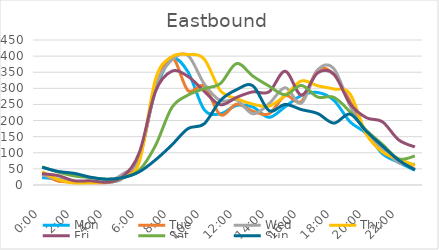
| Category | Mon | Tue | Wed | Thu | Fri | Sat | Sun |
|---|---|---|---|---|---|---|---|
| 0.0 | 23 | 35 | 32 | 41 | 35 | 56 | 55 |
| 0.041667 | 18 | 12 | 17 | 17 | 29 | 40 | 42 |
| 0.083333 | 8 | 11 | 10 | 5 | 13 | 28 | 36 |
| 0.125 | 12 | 7 | 9 | 6 | 13 | 23 | 24 |
| 0.166667 | 8 | 7 | 10 | 10 | 9 | 18 | 18 |
| 0.208333 | 22 | 23 | 35 | 25 | 27 | 23 | 23 |
| 0.25 | 92 | 83 | 84 | 72 | 101 | 46 | 41 |
| 0.291667 | 293 | 299 | 304 | 329 | 291 | 123 | 78 |
| 0.333333 | 391 | 396 | 388 | 398 | 353 | 240 | 124 |
| 0.375 | 351 | 293 | 402 | 405 | 337 | 279 | 175 |
| 0.416667 | 234 | 307 | 314 | 391 | 291 | 299 | 190 |
| 0.458333 | 221 | 218 | 262 | 293 | 249 | 315 | 262 |
| 0.5 | 247 | 251 | 264 | 268 | 272 | 377 | 296 |
| 0.541667 | 242 | 229 | 221 | 251 | 289 | 338 | 308 |
| 0.5833333333333334 | 210 | 221 | 252 | 245 | 289 | 307 | 231 |
| 0.625 | 243 | 277 | 302 | 278 | 353 | 280 | 250 |
| 0.666667 | 278 | 259 | 254 | 323 | 279 | 309 | 234 |
| 0.708333 | 287 | 357 | 357 | 308 | 348 | 273 | 222 |
| 0.75 | 263 | 343 | 361 | 298 | 344 | 272 | 192 |
| 0.791667 | 196 | 260 | 246 | 283 | 252 | 227 | 220 |
| 0.833333 | 160 | 161 | 161 | 158 | 209 | 170 | 167 |
| 0.875 | 97 | 103 | 114 | 103 | 196 | 126 | 121 |
| 0.916667 | 70 | 76 | 69 | 81 | 140 | 81 | 77 |
| 0.958333 | 46 | 49 | 64 | 61 | 118 | 90 | 47 |